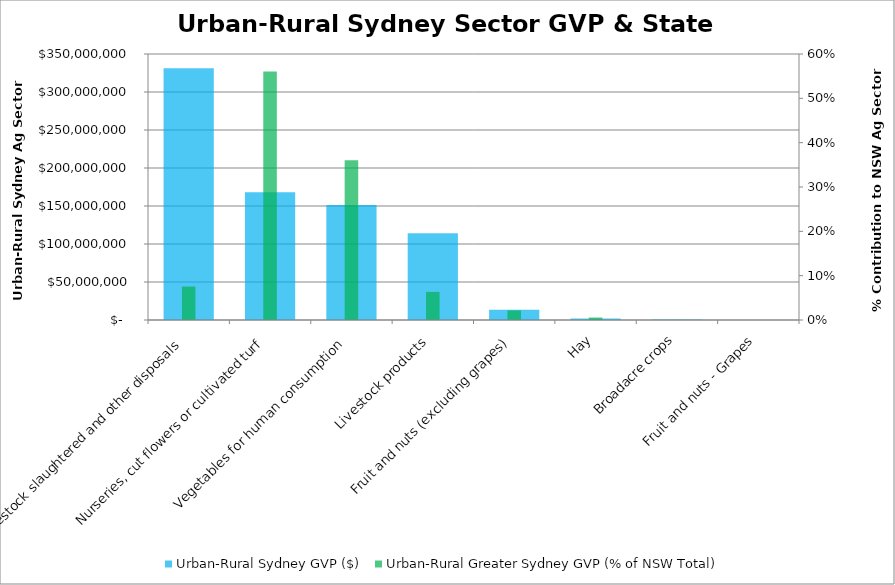
| Category | Urban-Rural Sydney GVP ($) |
|---|---|
| Livestock slaughtered and other disposals | 331193119.25 |
| Nurseries, cut flowers or cultivated turf | 168161772.14 |
| Vegetables for human consumption | 151413427.96 |
| Livestock products | 114035084.78 |
| Fruit and nuts (excluding grapes) | 13341763.24 |
| Hay | 1817086.29 |
| Broadacre crops | 592998.34 |
| Fruit and nuts - Grapes | 12665.65 |